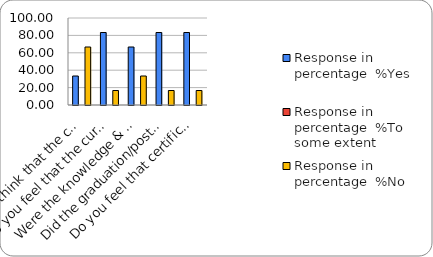
| Category | Response in percentage  |
|---|---|
| Do you think that the curriculum which you had during your graduation/post graduation has provided you with the knowledge & skills necessary to get employed/Self-employed or start own business? | 66.667 |
| Do you feel that the curriculum you studied is helpful in progression to higher studies? | 16.667 |
| Were the knowledge & skills acquired through the curriculum useful to you while working on the job?   | 33.333 |
| Did the graduation/post-graduation programme bring about any attitudinal and behavioural change in you? | 16.667 |
| Do you feel that certificate/ diploma courses offered by the college in addition to the curriculum lead to better career prospects? | 16.667 |